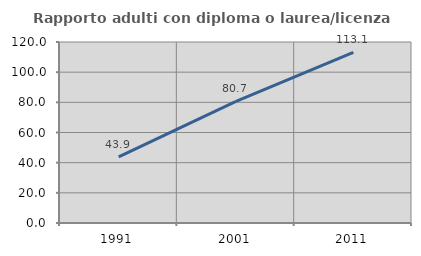
| Category | Rapporto adulti con diploma o laurea/licenza media  |
|---|---|
| 1991.0 | 43.852 |
| 2001.0 | 80.688 |
| 2011.0 | 113.112 |